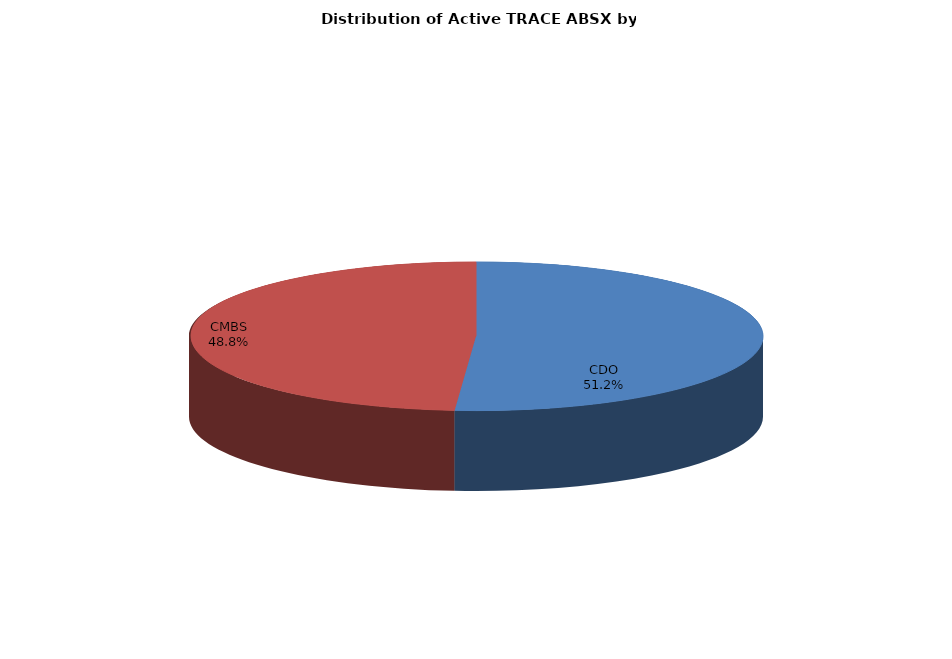
| Category | Series 0 |
|---|---|
| CDO | 9393 |
| CMBS | 8959 |